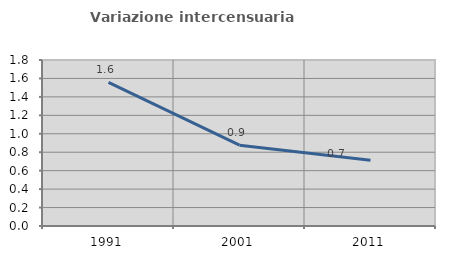
| Category | Variazione intercensuaria annua |
|---|---|
| 1991.0 | 1.557 |
| 2001.0 | 0.876 |
| 2011.0 | 0.714 |